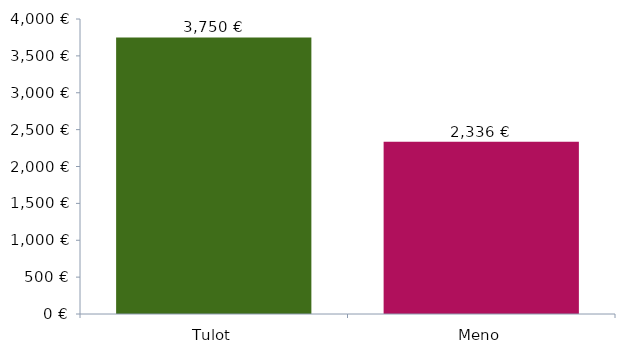
| Category | Kaaviotiedot |
|---|---|
| 0 | 3750 |
| 1 | 2336 |